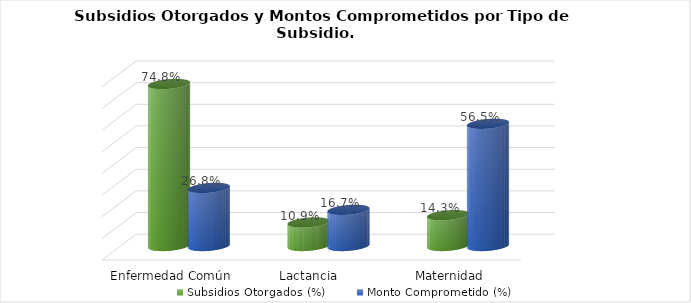
| Category | Subsidios Otorgados (%) | Monto Comprometido (%) |
|---|---|---|
| Enfermedad Común | 0.748 | 0.268 |
| Lactancia  | 0.109 | 0.167 |
| Maternidad | 0.143 | 0.565 |